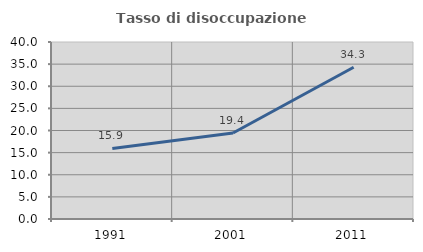
| Category | Tasso di disoccupazione giovanile  |
|---|---|
| 1991.0 | 15.942 |
| 2001.0 | 19.444 |
| 2011.0 | 34.286 |